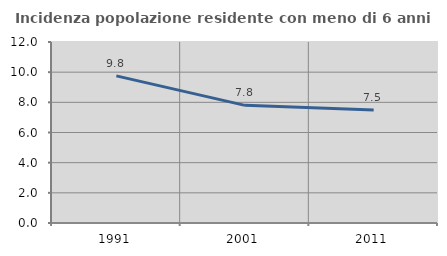
| Category | Incidenza popolazione residente con meno di 6 anni |
|---|---|
| 1991.0 | 9.757 |
| 2001.0 | 7.8 |
| 2011.0 | 7.49 |